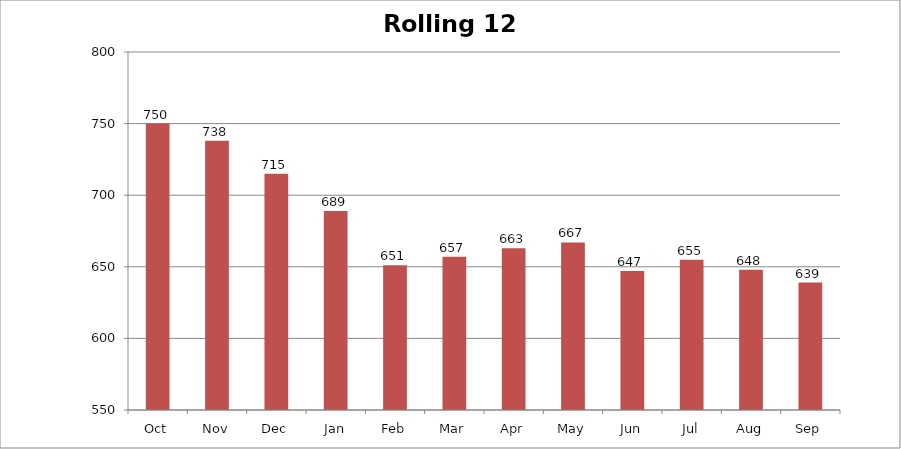
| Category | Rolling 12 Month |
|---|---|
| Oct | 750 |
| Nov | 738 |
| Dec | 715 |
| Jan | 689 |
| Feb | 651 |
| Mar | 657 |
| Apr | 663 |
| May | 667 |
| Jun | 647 |
| Jul | 655 |
| Aug | 648 |
| Sep | 639 |